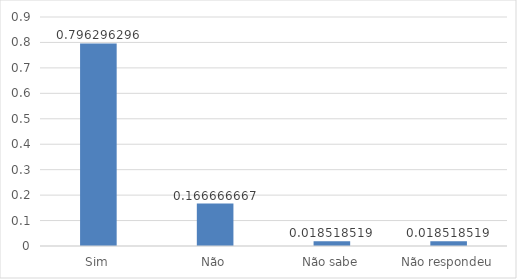
| Category | Series 0 |
|---|---|
| Sim | 0.796 |
| Não | 0.167 |
| Não sabe | 0.019 |
| Não respondeu | 0.019 |